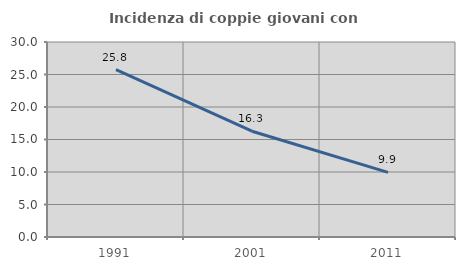
| Category | Incidenza di coppie giovani con figli |
|---|---|
| 1991.0 | 25.764 |
| 2001.0 | 16.272 |
| 2011.0 | 9.941 |